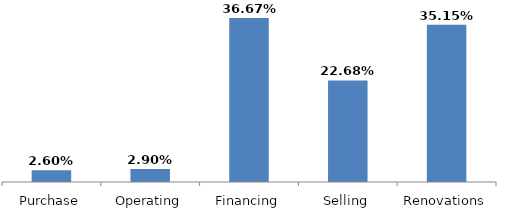
| Category | Purchase |
|---|---|
| Purchase | 0.026 |
| Operating | 0.029 |
| Financing | 0.367 |
| Selling | 0.227 |
| Renovations | 0.351 |